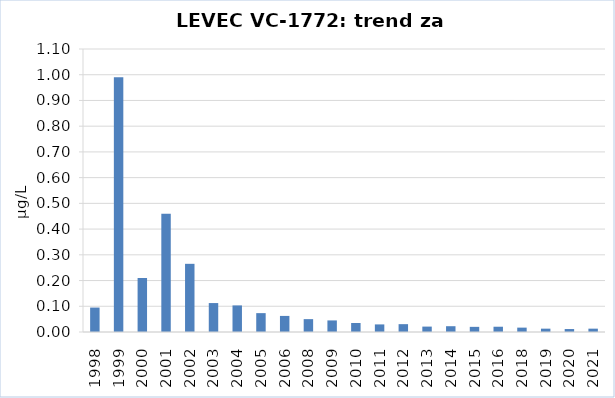
| Category | Vsota |
|---|---|
| 1998 | 0.095 |
| 1999 | 0.99 |
| 2000 | 0.21 |
| 2001 | 0.46 |
| 2002 | 0.265 |
| 2003 | 0.112 |
| 2004 | 0.103 |
| 2005 | 0.073 |
| 2006 | 0.062 |
| 2008 | 0.05 |
| 2009 | 0.045 |
| 2010 | 0.035 |
| 2011 | 0.03 |
| 2012 | 0.03 |
| 2013 | 0.021 |
| 2014 | 0.022 |
| 2015 | 0.02 |
| 2016 | 0.02 |
| 2018 | 0.017 |
| 2019 | 0.013 |
| 2020 | 0.012 |
| 2021 | 0.013 |